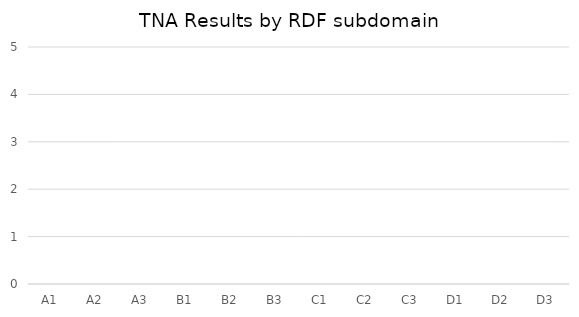
| Category | Series 1 |
|---|---|
| A1 | 0 |
| A2 | 0 |
| A3 | 0 |
| B1 | 0 |
| B2 | 0 |
| B3 | 0 |
| C1 | 0 |
| C2 | 0 |
| C3 | 0 |
| D1 | 0 |
| D2 | 0 |
| D3 | 0 |